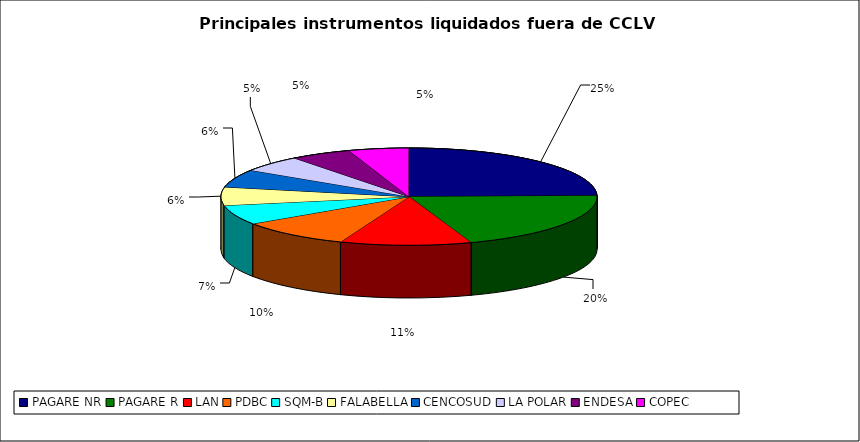
| Category | Series 0 |
|---|---|
| PAGARE NR | 1804 |
| PAGARE R | 1460 |
| LAN | 825 |
| PDBC | 706 |
| SQM-B | 477 |
| FALABELLA | 444 |
| CENCOSUD | 434 |
| LA POLAR | 398 |
| ENDESA | 383 |
| COPEC | 379 |